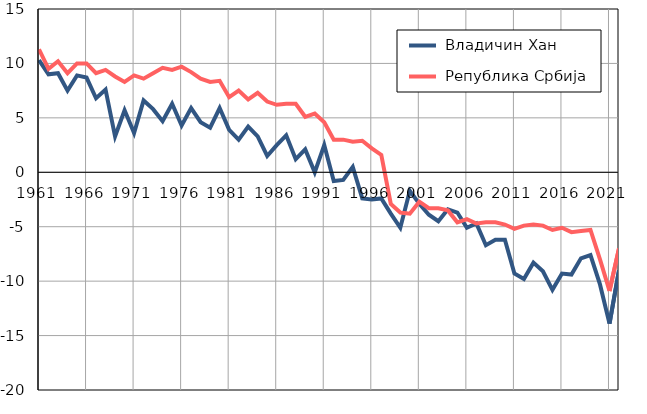
| Category |  Владичин Хан |  Република Србија |
|---|---|---|
| 1961.0 | 10.3 | 11.3 |
| 1962.0 | 9 | 9.5 |
| 1963.0 | 9.1 | 10.2 |
| 1964.0 | 7.5 | 9.1 |
| 1965.0 | 8.9 | 10 |
| 1966.0 | 8.7 | 10 |
| 1967.0 | 6.8 | 9.1 |
| 1968.0 | 7.6 | 9.4 |
| 1969.0 | 3.3 | 8.8 |
| 1970.0 | 5.7 | 8.3 |
| 1971.0 | 3.6 | 8.9 |
| 1972.0 | 6.6 | 8.6 |
| 1973.0 | 5.8 | 9.1 |
| 1974.0 | 4.7 | 9.6 |
| 1975.0 | 6.3 | 9.4 |
| 1976.0 | 4.3 | 9.7 |
| 1977.0 | 5.9 | 9.2 |
| 1978.0 | 4.6 | 8.6 |
| 1979.0 | 4.1 | 8.3 |
| 1980.0 | 5.9 | 8.4 |
| 1981.0 | 3.9 | 6.9 |
| 1982.0 | 3 | 7.5 |
| 1983.0 | 4.2 | 6.7 |
| 1984.0 | 3.3 | 7.3 |
| 1985.0 | 1.5 | 6.5 |
| 1986.0 | 2.5 | 6.2 |
| 1987.0 | 3.4 | 6.3 |
| 1988.0 | 1.2 | 6.3 |
| 1989.0 | 2.1 | 5.1 |
| 1990.0 | 0 | 5.4 |
| 1991.0 | 2.5 | 4.6 |
| 1992.0 | -0.8 | 3 |
| 1993.0 | -0.7 | 3 |
| 1994.0 | 0.5 | 2.8 |
| 1995.0 | -2.4 | 2.9 |
| 1996.0 | -2.5 | 2.2 |
| 1997.0 | -2.4 | 1.6 |
| 1998.0 | -3.8 | -2.9 |
| 1999.0 | -5.1 | -3.7 |
| 2000.0 | -1.7 | -3.8 |
| 2001.0 | -2.9 | -2.7 |
| 2002.0 | -3.9 | -3.3 |
| 2003.0 | -4.5 | -3.3 |
| 2004.0 | -3.4 | -3.5 |
| 2005.0 | -3.7 | -4.6 |
| 2006.0 | -5.1 | -4.3 |
| 2007.0 | -4.7 | -4.7 |
| 2008.0 | -6.7 | -4.6 |
| 2009.0 | -6.2 | -4.6 |
| 2010.0 | -6.2 | -4.8 |
| 2011.0 | -9.3 | -5.2 |
| 2012.0 | -9.8 | -4.9 |
| 2013.0 | -8.3 | -4.8 |
| 2014.0 | -9.1 | -4.9 |
| 2015.0 | -10.8 | -5.3 |
| 2016.0 | -9.3 | -5.1 |
| 2017.0 | -9.4 | -5.5 |
| 2018.0 | -7.9 | -5.4 |
| 2019.0 | -7.6 | -5.3 |
| 2020.0 | -10.3 | -8 |
| 2021.0 | -13.9 | -10.9 |
| 2022.0 | -9 | -7 |